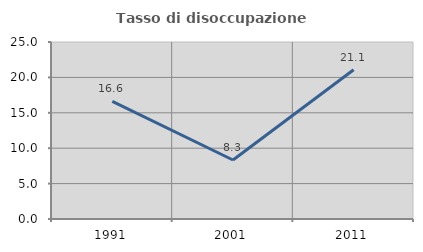
| Category | Tasso di disoccupazione giovanile  |
|---|---|
| 1991.0 | 16.625 |
| 2001.0 | 8.333 |
| 2011.0 | 21.078 |